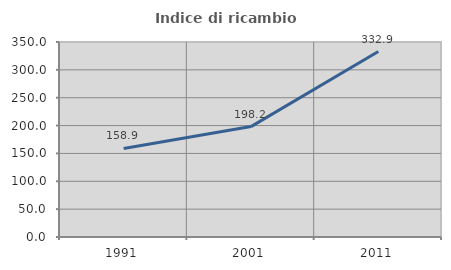
| Category | Indice di ricambio occupazionale  |
|---|---|
| 1991.0 | 158.919 |
| 2001.0 | 198.154 |
| 2011.0 | 332.9 |